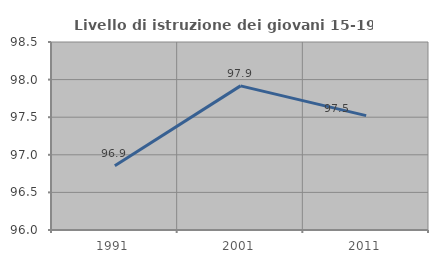
| Category | Livello di istruzione dei giovani 15-19 anni |
|---|---|
| 1991.0 | 96.855 |
| 2001.0 | 97.917 |
| 2011.0 | 97.521 |